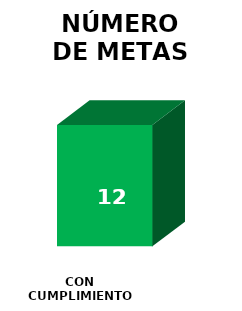
| Category | NÚMERO DE METAS |
|---|---|
| CON CUMPLIMIENTO PROYECTADO 2023  | 12 |